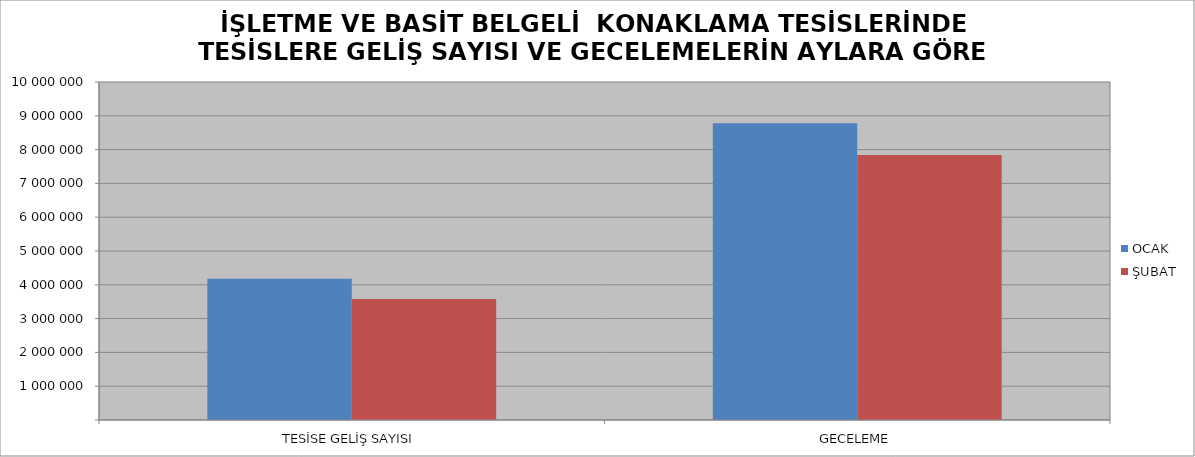
| Category | OCAK | ŞUBAT |
|---|---|---|
| TESİSE GELİŞ SAYISI | 4176369 | 3577989 |
| GECELEME | 8783046 | 7837722 |